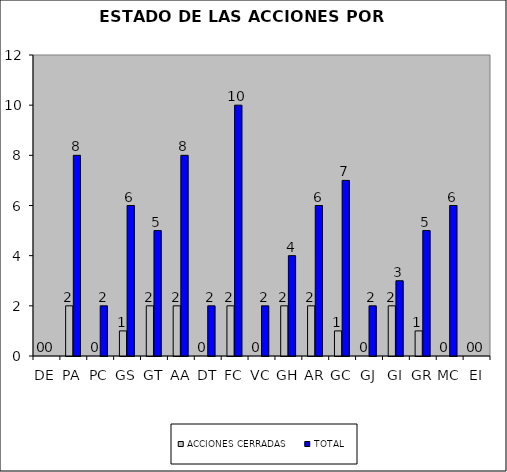
| Category | ACCIONES CERRADAS | TOTAL |
|---|---|---|
| DE | 0 | 0 |
| PA | 2 | 8 |
| PC | 0 | 2 |
| GS | 1 | 6 |
| GT | 2 | 5 |
| AA | 2 | 8 |
| DT | 0 | 2 |
| FC | 2 | 10 |
| VC | 0 | 2 |
| GH | 2 | 4 |
| AR | 2 | 6 |
| GC | 1 | 7 |
| GJ | 0 | 2 |
| GI | 2 | 3 |
| GR | 1 | 5 |
| MC | 0 | 6 |
| EI | 0 | 0 |